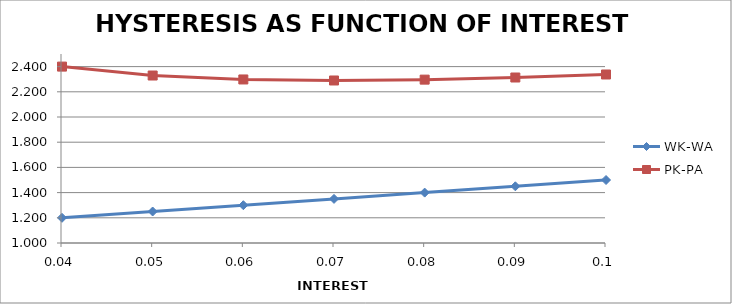
| Category | WK-WA | PK-PA |
|---|---|---|
| 0.04 | 1.2 | 2.4 |
| 0.05 | 1.25 | 2.329 |
| 0.060000000000000005 | 1.3 | 2.298 |
| 0.07 | 1.35 | 2.29 |
| 0.08 | 1.4 | 2.297 |
| 0.09 | 1.45 | 2.313 |
| 0.09999999999999999 | 1.5 | 2.337 |